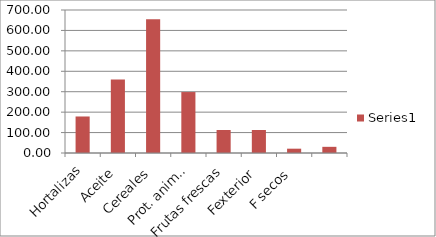
| Category | Series 0 |
|---|---|
| Hortalizas | 178.741 |
| Aceite | 359.67 |
| Cereales | 654.373 |
| Prot. animal | 298.35 |
| Frutas frescas | 112.577 |
| Fexterior | 112.577 |
|      F secos | 21.12 |